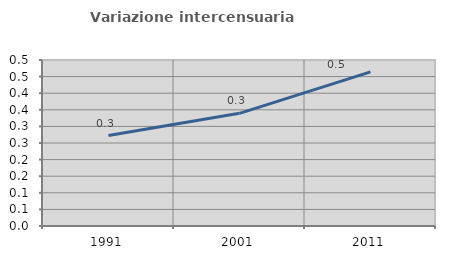
| Category | Variazione intercensuaria annua |
|---|---|
| 1991.0 | 0.272 |
| 2001.0 | 0.339 |
| 2011.0 | 0.464 |